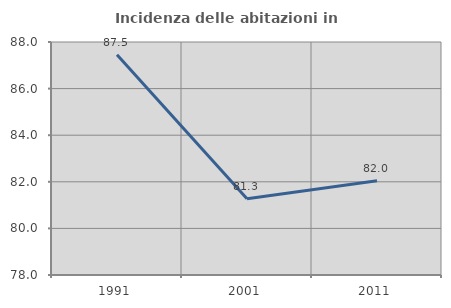
| Category | Incidenza delle abitazioni in proprietà  |
|---|---|
| 1991.0 | 87.455 |
| 2001.0 | 81.27 |
| 2011.0 | 82.043 |